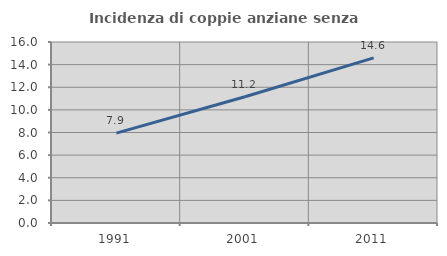
| Category | Incidenza di coppie anziane senza figli  |
|---|---|
| 1991.0 | 7.94 |
| 2001.0 | 11.165 |
| 2011.0 | 14.601 |